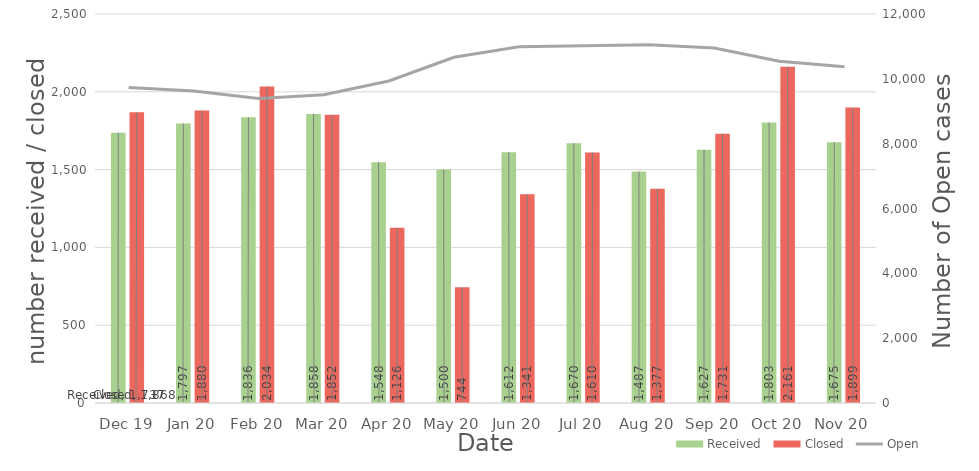
| Category | Received | Closed |
|---|---|---|
| Dec 19 | 1737 | 1868 |
| Jan 20 | 1797 | 1880 |
| Feb 20 | 1836 | 2034 |
| Mar 20 | 1858 | 1852 |
| Apr 20 | 1548 | 1126 |
| May 20 | 1500 | 744 |
| Jun 20 | 1612 | 1341 |
| Jul 20 | 1670 | 1610 |
| Aug 20 | 1487 | 1377 |
| Sep 20 | 1627 | 1731 |
| Oct 20 | 1803 | 2161 |
| Nov 20 | 1675 | 1899 |